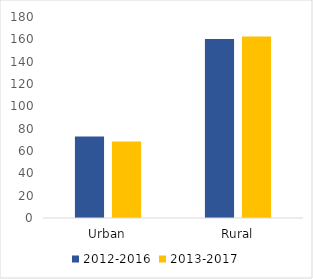
| Category | 2012-2016 | 2013-2017 |
|---|---|---|
| Urban | 73 | 68.6 |
| Rural | 160.2 | 162.6 |